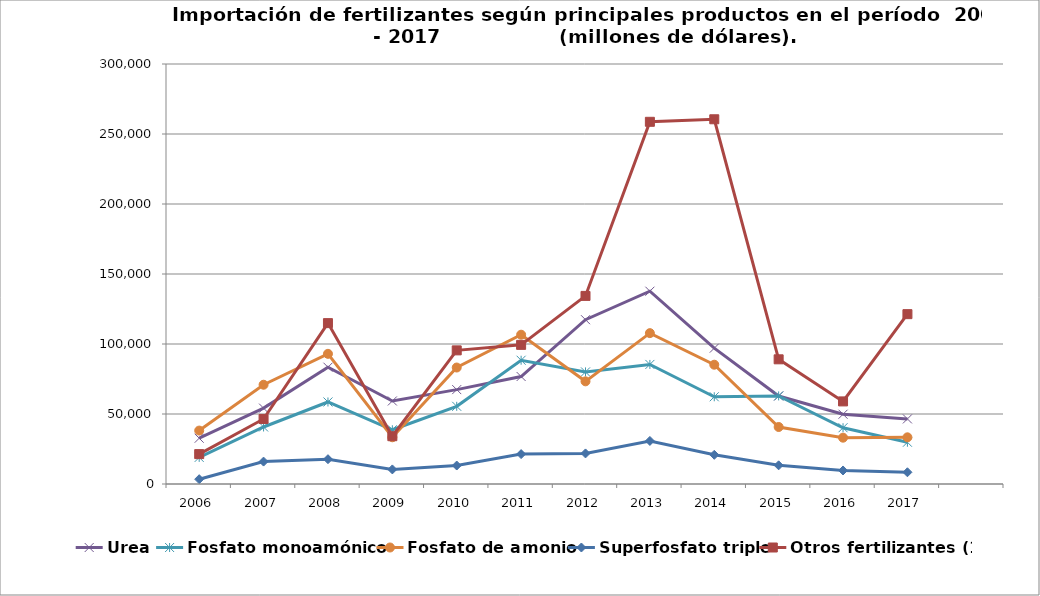
| Category | Urea | Fosfato monoamónico | Fosfato de amonio | Superfosfato triple | Otros fertilizantes (1) |
|---|---|---|---|---|---|
| 2006.0 | 32694.392 | 19013.779 | 38153.144 | 3435.063 | 21359.279 |
| 2007.0 | 54187 | 40728 | 70904 | 16007 | 46446 |
| 2008.0 | 83425.049 | 58586.094 | 92975.124 | 17717.196 | 114920.945 |
| 2009.0 | 59306.057 | 38735.899 | 33378.485 | 10420.329 | 34131.604 |
| 2010.0 | 67423 | 55486 | 83197 | 13192 | 95447 |
| 2011.0 | 76778 | 88404 | 106636 | 21359 | 99381 |
| 2012.0 | 117356 | 80057 | 73334 | 21840 | 134359 |
| 2013.0 | 137711 | 85404 | 107761 | 30755 | 258711 |
| 2014.0 | 97025 | 62303 | 85205 | 20849 | 260515 |
| 2015.0 | 62847.871 | 62928.813 | 40720.88 | 13329.393 | 89062.441 |
| 2016.0 | 49834.961 | 40198.541 | 33091.254 | 9654.961 | 58993.997 |
| 2017.0 | 46484.883 | 29828.419 | 33351.642 | 8372.954 | 121322.511 |